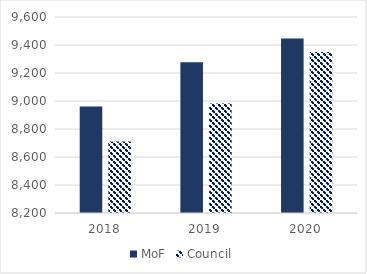
| Category | MoF | Council |
|---|---|---|
| 2018.0 | 8960.544 | 8711.33 |
| 2019.0 | 9276.348 | 8982.901 |
| 2020.0 | 9446.527 | 9350.363 |